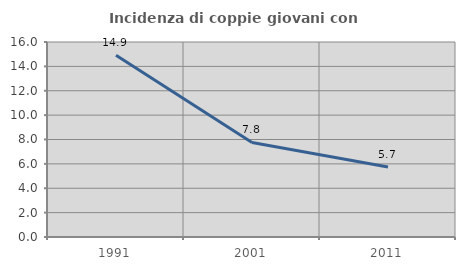
| Category | Incidenza di coppie giovani con figli |
|---|---|
| 1991.0 | 14.906 |
| 2001.0 | 7.762 |
| 2011.0 | 5.742 |